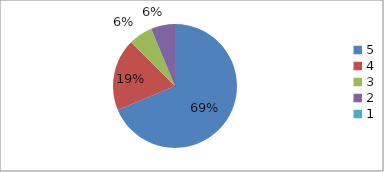
| Category | Series 0 | Series 1 |
|---|---|---|
| 5.0 | 73.3 | 73.3 |
| 4.0 | 20 | 20 |
| 3.0 | 6.7 | 6.7 |
| 2.0 | 6.7 | 6.7 |
| 1.0 | 0 | 0 |